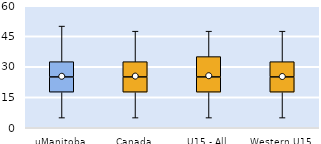
| Category | 25th | 50th | 75th |
|---|---|---|---|
| uManitoba | 17.5 | 7.5 | 7.5 |
| Canada | 17.5 | 7.5 | 7.5 |
| U15 - All | 17.5 | 7.5 | 10 |
| Western U15 | 17.5 | 7.5 | 7.5 |